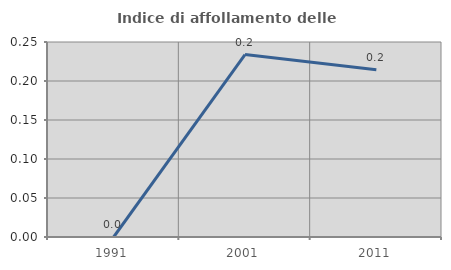
| Category | Indice di affollamento delle abitazioni  |
|---|---|
| 1991.0 | 0 |
| 2001.0 | 0.234 |
| 2011.0 | 0.214 |